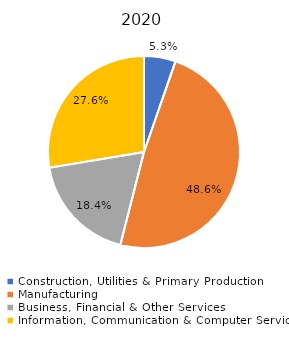
| Category | Series 0 |
|---|---|
| Construction, Utilities & Primary Production  | 0.053 |
| Manufacturing  | 0.486 |
| Business, Financial & Other Services | 0.184 |
| Information, Communication & Computer Services | 0.276 |